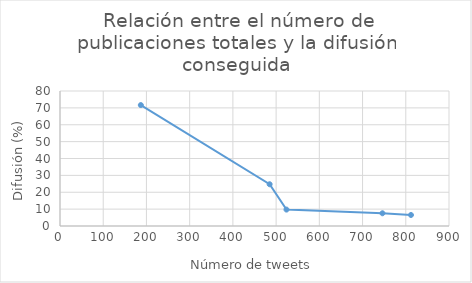
| Category | Series 0 |
|---|---|
| 812.0 | 6.53 |
| 746.0 | 7.54 |
| 524.0 | 9.73 |
| 485.0 | 24.74 |
| 187.0 | 71.66 |